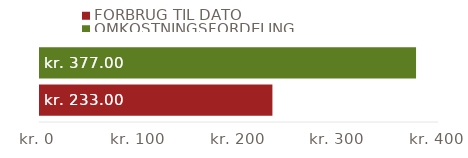
| Category | FORBRUG TIL DATO | OMKOSTNINGSFORDELING |
|---|---|---|
| TOTALER | 233 | 377 |